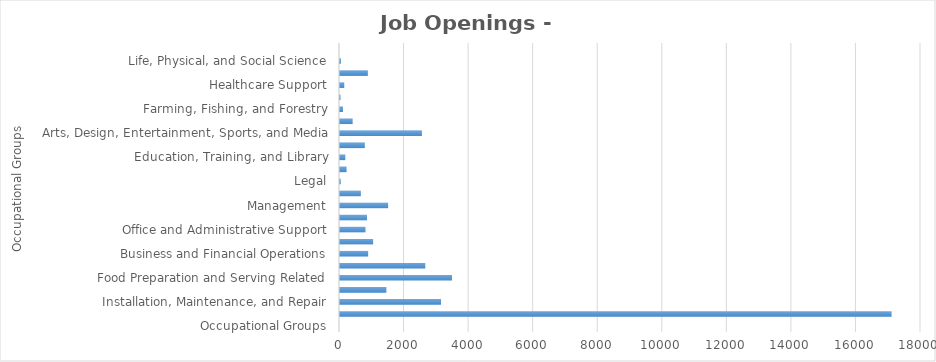
| Category | Series1 |
|---|---|
| Occupational Groups | 0 |
| Construction and Extraction | 17089 |
| Installation, Maintenance, and Repair | 3130 |
| Building and Grounds Cleaning and Maintenance | 1437 |
| Food Preparation and Serving Related | 3470 |
| Personal Care and Service | 2643 |
| Business and Financial Operations | 873 |
| Sales and Related | 1026 |
| Office and Administrative Support | 790 |
| Architecture and Engineering | 837 |
| Management | 1491 |
| Transportation and Material Moving | 646 |
| Legal | 23 |
| Healthcare Practitioners and Technical | 204 |
| Education, Training, and Library | 165 |
| Production | 769 |
| Arts, Design, Entertainment, Sports, and Media | 2538 |
| Computer and Mathematical | 392 |
| Farming, Fishing, and Forestry | 91 |
| Community and Social Services | 17 |
| Healthcare Support | 132 |
| Protective Service | 863 |
| Life, Physical, and Social Science | 28 |
| Military Specific  | 0 |